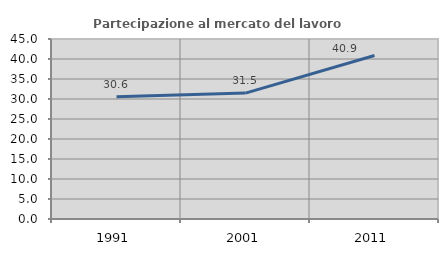
| Category | Partecipazione al mercato del lavoro  femminile |
|---|---|
| 1991.0 | 30.588 |
| 2001.0 | 31.483 |
| 2011.0 | 40.881 |